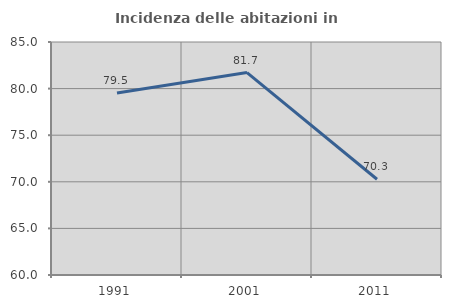
| Category | Incidenza delle abitazioni in proprietà  |
|---|---|
| 1991.0 | 79.518 |
| 2001.0 | 81.72 |
| 2011.0 | 70.27 |